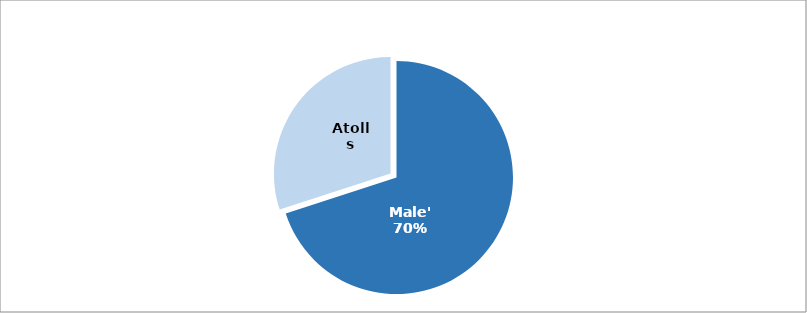
| Category | Series 0 |
|---|---|
| Male' | 9478 |
| Atolls | 4065 |